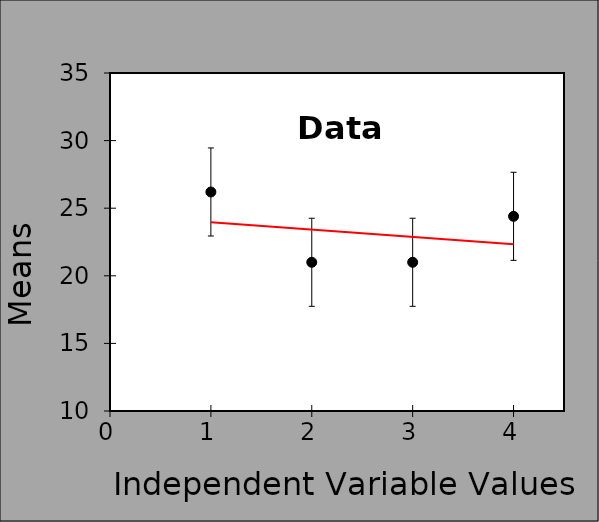
| Category | Data |
|---|---|
| 1.0 | 26.2 |
| 2.0 | 21 |
| 3.0 | 21 |
| 4.0 | 24.4 |